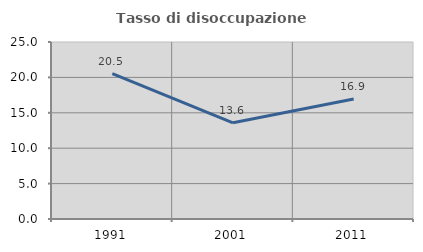
| Category | Tasso di disoccupazione giovanile  |
|---|---|
| 1991.0 | 20.524 |
| 2001.0 | 13.592 |
| 2011.0 | 16.949 |